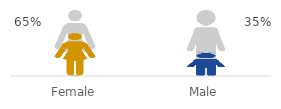
| Category | Series 1 | Series 0 |
|---|---|---|
| Female | 1 | 0.647 |
| Male | 1 | 0.353 |